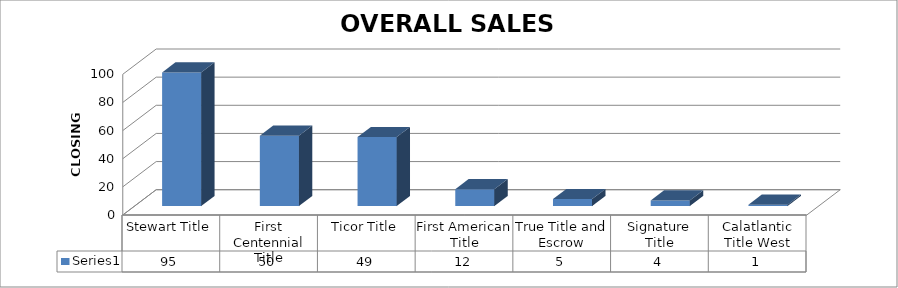
| Category | Series 0 |
|---|---|
| Stewart Title | 95 |
| First Centennial Title | 50 |
| Ticor Title | 49 |
| First American Title | 12 |
| True Title and Escrow | 5 |
| Signature Title | 4 |
| Calatlantic Title West | 1 |